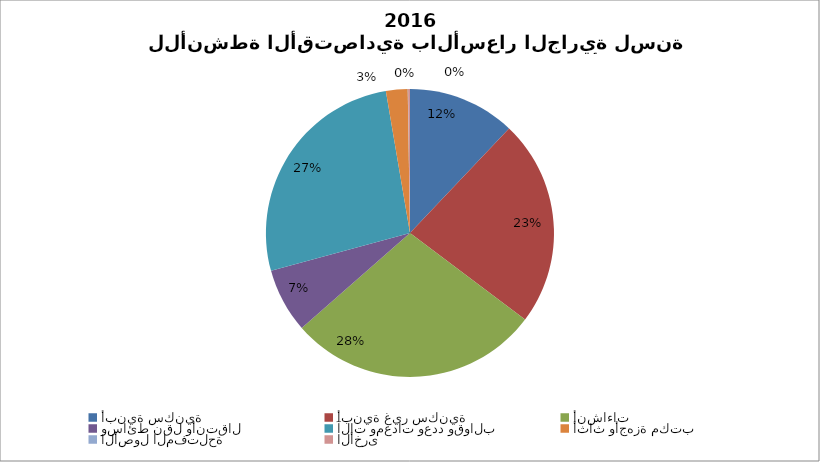
| Category | Series 0 |
|---|---|
| أبنية سكنية | 28607079.215 |
| أبنية غير سكنية | 54964721.898 |
| أنشاءات | 66999172.418 |
| وسائط نقل وأنتقال | 17143636.581 |
| آلات ومعدات وعدد وقوالب | 62889583.44 |
| أثاث وأجهزة مكتب | 5763153.483 |
| الأصول المفتلحة | 88589.539 |
| الأخرى  | 508609.766 |